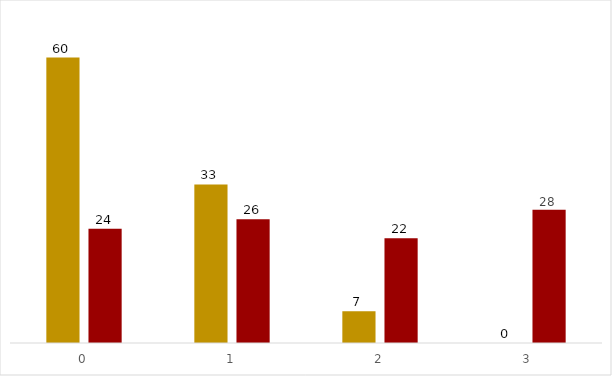
| Category | CRT com esgotamento do ego | CRT |
|---|---|---|
| 0.0 | 0.6 | 0.24 |
| 1.0 | 0.333 | 0.26 |
| 2.0 | 0.067 | 0.22 |
| 3.0 | 0 | 0.28 |